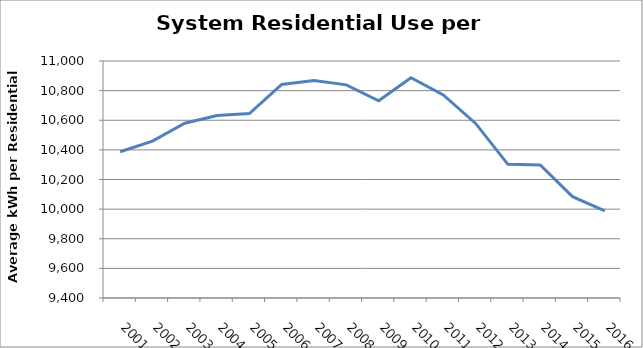
| Category | Series 0 |
|---|---|
| 2001.0 | 10387.456 |
| 2002.0 | 10459.532 |
| 2003.0 | 10580.241 |
| 2004.0 | 10631.985 |
| 2005.0 | 10645.054 |
| 2006.0 | 10841.587 |
| 2007.0 | 10868.423 |
| 2008.0 | 10838.841 |
| 2009.0 | 10731.692 |
| 2010.0 | 10887.564 |
| 2011.0 | 10771.333 |
| 2012.0 | 10578.603 |
| 2013.0 | 10302.167 |
| 2014.0 | 10298.421 |
| 2015.0 | 10084.273 |
| 2016.0 | 9988.272 |